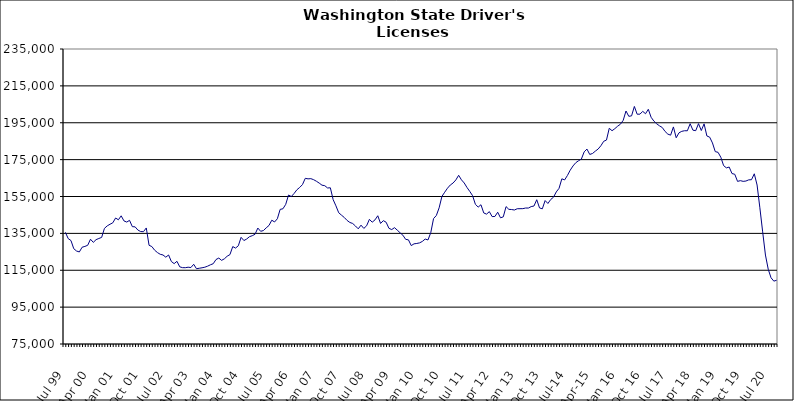
| Category | Series 0 |
|---|---|
| Jul 99 | 135560 |
| Aug 99 | 132182 |
| Sep 99 | 131104 |
| Oct 99 | 126694 |
| Nov 99 | 125425 |
| Dec 99 | 124927 |
| Jan 00 | 127499 |
| Feb 00 | 127927 |
| Mar 00 | 128547 |
| Apr 00 | 131834 |
| May 00 | 130120 |
| Jun 00 | 131595 |
| Jul 00 | 132236 |
| Aug 00 | 132819 |
| Sep 00 | 137711 |
| Oct 00 | 139063 |
| Nov 00 | 139952 |
| Dec 00 | 140732 |
| Jan 01 | 143338 |
| Feb 01 | 142359 |
| Mar 01 | 144523 |
| Apr 01 | 141758 |
| May 01 | 141135 |
| Jun 01 | 142064 |
| Jul 01 | 138646 |
| Aug 01 | 138530 |
| Sep 01 | 136784 |
| Oct 01 | 135996 |
| Nov 01 | 135917 |
| Dec 01 | 137940 |
| Jan 02 | 128531 |
| Feb 02 | 127848 |
| Mar 02 | 125876 |
| Apr 02 | 124595 |
| May 02 | 123660 |
| Jun 02 | 123282 |
| Jul 02 | 122089 |
| Aug 02 | 123279 |
| Sep 02 | 119727 |
| Oct 02 | 118588 |
| Nov 02 | 119854 |
| Dec 02 | 116851 |
| Jan 03 | 116407 |
| Feb 03 | 116382 |
| Mar 03 | 116648 |
| Apr 03 | 116471 |
| May 03 | 118231 |
| Jun 03 | 115831 |
| Jul 03 | 116082 |
| Aug 03 | 116341 |
| Sep 03 | 116653 |
| Oct 03 | 117212 |
| Nov 03 | 117962 |
| Dec 03 | 118542 |
| Jan 04 | 120817 |
| Feb 04 | 121617 |
| Mar 04 | 120369 |
| Apr 04 | 121200 |
| May 04 | 122609 |
| Jun 04 | 123484 |
| Jul 04 | 127844 |
| Aug 04 | 127025 |
| Sep 04 | 128273 |
| Oct 04 | 132853 |
| Nov 04 | 131106 |
| Dec 04 | 131935 |
| Jan 05 | 133205 |
| Feb 05 | 133736 |
| Mar 05 | 134528 |
| Apr 05 | 137889 |
| May 05 | 136130 |
| Jun 05 | 136523 |
| Jul 05 | 137997 |
| Aug 05 | 139294 |
| Sep 05 | 142140 |
| Oct 05 | 141192 |
| Nov 05 | 142937 |
| Dec 05 | 148013 |
| Jan 06 | 148341 |
| Feb 06 | 150744 |
| Mar 06 | 155794 |
| Apr 06 | 154984 |
| May 06 | 156651 |
| Jun 06 | 158638 |
| Jul 06 | 159911 |
| Aug 06 | 161445 |
| Sep 06 | 164852 |
| Oct 06 | 164570 |
| Nov 06 | 164679 |
| Dec 06 | 164127 |
| Jan 07 | 163271 |
| Feb 07 | 162273 |
| Mar 07 | 161140 |
| Apr 07 | 160860 |
| May 07 | 159633 |
| Jun 07 | 159724 |
| Jul 07 | 153303 |
| Aug 07 | 149939 |
| Sep 07 | 146172 |
| Oct 07 | 144876 |
| Nov 07 | 143613 |
| Dec 07 | 142022 |
| Jan 08 | 140909 |
| Feb 08 | 140368 |
| Mar 08 | 138998 |
| Apr 08 | 137471 |
| May 08 | 139453 |
| Jun 08 | 137680 |
| Jul 08 | 139120 |
| Aug 08 | 142612 |
| Sep-08 | 141071 |
| Oct 08 | 142313 |
| Nov 08 | 144556 |
| Dec 08 | 140394 |
| Jan 09 | 141903 |
| Feb 09 | 141036 |
| Mar 09 | 137751 |
| Apr 09 | 137060 |
| May 09 | 138101 |
| Jun 09 | 136739 |
| Jul 09 | 135317 |
| Aug 09 | 134020 |
| Sep 09 | 131756 |
| Oct 09 | 131488 |
| Nov 09 | 128370 |
| Dec 09 | 129323 |
| Jan 10 | 129531 |
| Feb 10 | 129848 |
| Mar 10 | 130654 |
| Apr 10 | 131929 |
| May 10 | 131429 |
| Jun 10 | 135357 |
| Jul 10 | 143032 |
| Aug 10 | 144686 |
| Sep 10 | 148856 |
| Oct 10 | 155042 |
| Nov 10 | 157328 |
| Dec 10 | 159501 |
| Jan 11 | 161221 |
| Feb 11 | 162312 |
| Mar 11 | 163996 |
| Apr 11 | 166495 |
| May 11 | 164040 |
| Jun 11 | 162324 |
| Jul 11 | 159862 |
| Aug 11 | 157738 |
| Sep 11 | 155430 |
| Oct 11 | 150762 |
| Nov 11 | 149255 |
| Dec 11 | 150533 |
| Jan 12 | 146068 |
| Feb 12 | 145446 |
| Mar 12 | 146788 |
| Apr 12 | 144110 |
| May 12 | 144162 |
| Jun 12 | 146482 |
| Jul 12 | 143445 |
| Aug 12 | 143950 |
| Sep 12 | 149520 |
| Oct 12 | 148033 |
| Nov 12 | 147926 |
| Dec 12 | 147674 |
| Jan 13 | 148360 |
| Feb-13 | 148388 |
| Mar-13 | 148414 |
| Apr 13 | 148749 |
| May 13 | 148735 |
| Jun-13 | 149521 |
| Jul 13 | 149837 |
| Aug 13 | 153252 |
| Sep 13 | 148803 |
| Oct 13 | 148315 |
| Nov 13 | 152804 |
| Dec 13 | 151209 |
| Jan 14 | 153357 |
| Feb-14 | 154608 |
| Mar 14 | 157479 |
| Apr 14 | 159441 |
| May 14 | 164591 |
| Jun 14 | 163995 |
| Jul-14 | 166411 |
| Aug-14 | 169272 |
| Sep 14 | 171565 |
| Oct 14 | 173335 |
| Nov 14 | 174406 |
| Dec 14 | 175302 |
| Jan 15 | 179204 |
| Feb 15 | 180737 |
| Mar 15 | 177810 |
| Apr-15 | 178331 |
| May 15 | 179601 |
| Jun-15 | 180729 |
| Jul 15 | 182540 |
| Aug 15 | 184924 |
| Sep 15 | 185620 |
| Oct 15 | 192002 |
| Nov 15 | 190681 |
| Dec 15 | 191795 |
| Jan 16 | 193132 |
| Feb 16 | 194206 |
| Mar 16 | 196319 |
| Apr 16 | 201373 |
| May 16 | 198500 |
| Jun 16 | 198743 |
| Jul 16 | 203841 |
| Aug 16 | 199630 |
| Sep 16 | 199655 |
| Oct 16 | 201181 |
| Nov 16 | 199888 |
| Dec 16 | 202304 |
| Jan 17 | 197977 |
| Feb 17 | 195889 |
| Mar 17 | 194438 |
| Apr 17 | 193335 |
| May 17 | 192430 |
| Jun 17 | 190298 |
| Jul 17 | 188832 |
| Aug 17 | 188264 |
| Sep 17 | 192738 |
| Oct 17 | 186856 |
| Nov 17 | 189537 |
| Dec 17 | 190341 |
| Jan 18 | 190670 |
| Feb 18 | 190645 |
| Mar 18 | 194476 |
| Apr 18 | 190971 |
| May 18 | 190707 |
| Jun 18 | 194516 |
| Jul 18 | 190783 |
| Aug 18 | 194390 |
| Sep 18 | 187831 |
| Oct 18 | 187188 |
| Nov 18 | 184054 |
| Dec 18 | 179347 |
| Jan 19 | 178958 |
| Feb 19 | 176289 |
| Mar 19 | 171747 |
| Apr 19 | 170532 |
| May 19 | 170967 |
| Jun 19 | 167444 |
| Jul 19 | 167059 |
| Aug 19 | 163194 |
| Sep 19 | 163599 |
| Oct 19 | 163212 |
| Nov 19 | 163388 |
| Dec 19 | 164024 |
| Jan 20 | 164114 |
| Feb 20 | 167320 |
| Mar 20 | 161221 |
| Apr 20 | 148866 |
| May 20 | 135821 |
| Jun 20 | 123252 |
| Jul 20 | 115526 |
| Aug 20 | 110940 |
| Sep 20 | 109099 |
| Oct 20 | 109566 |